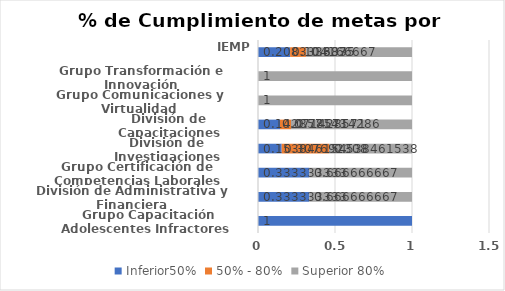
| Category | Inferior50% | 50% - 80% | Superior 80% |
|---|---|---|---|
| Grupo Capacitación Adolescentes Infractores  | 1 | 0 | 0 |
| División de Administrativa y Financiera | 0.333 | 0 | 0.667 |
| Grupo Certificación de Competencias Laborales | 0.333 | 0 | 0.667 |
| División de Investigaciones | 0.154 | 0.308 | 0.538 |
| División de Capacitaciones | 0.143 | 0.071 | 0.786 |
| Grupo Comunicaciones y Virtualidad | 0 | 0 | 1 |
| Grupo Transformación e Innovación | 0 | 0 | 1 |
| IEMP | 0.208 | 0.104 | 0.688 |